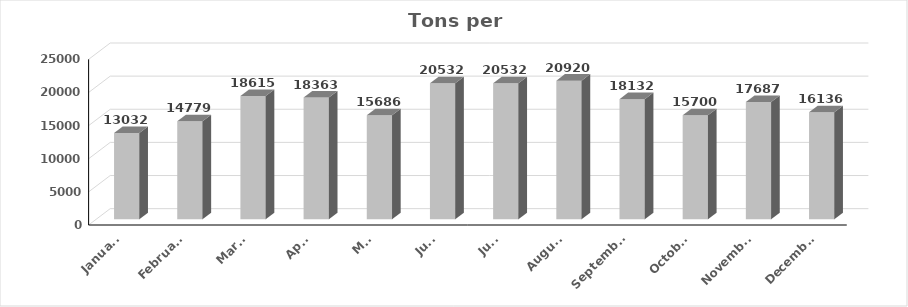
| Category | Tons |
|---|---|
| January | 13032 |
| February | 14779 |
| March | 18615 |
| April | 18363 |
| May | 15686 |
| June | 20532 |
| July | 20532 |
| August | 20920 |
| September | 18132 |
| October | 15700 |
| November | 17687 |
| December | 16136 |